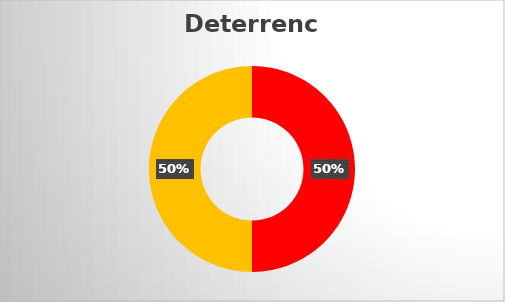
| Category | Series 0 |
|---|---|
| 0 | 0.25 |
| 1 | 0.25 |
| 2 | 0 |